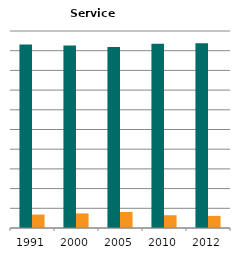
| Category | Male | Female |
|---|---|---|
| 1991.0 | 0.932 | 0.068 |
| 2000.0 | 0.926 | 0.074 |
| 2005.0 | 0.919 | 0.081 |
| 2010.0 | 0.935 | 0.065 |
| 2012.0 | 0.938 | 0.062 |